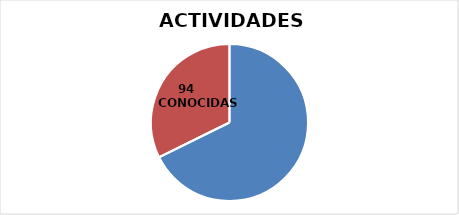
| Category | Series 0 |
|---|---|
| 0 | 197 |
| 1 | 94 |